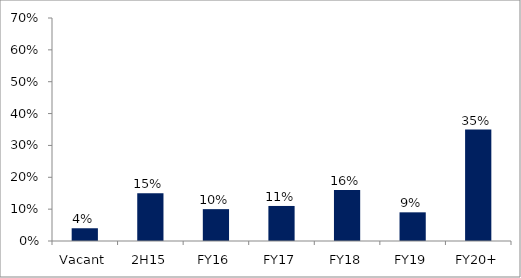
| Category | Series 0 |
|---|---|
| Vacant | 0.04 |
| 2H15 | 0.15 |
| FY16 | 0.1 |
| FY17 | 0.11 |
| FY18 | 0.16 |
| FY19 | 0.09 |
| FY20+ | 0.35 |